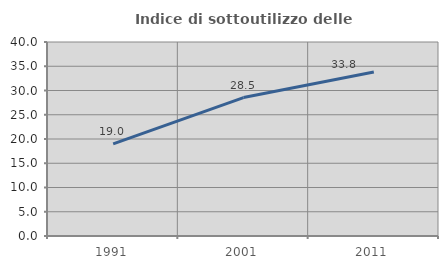
| Category | Indice di sottoutilizzo delle abitazioni  |
|---|---|
| 1991.0 | 19.01 |
| 2001.0 | 28.547 |
| 2011.0 | 33.826 |